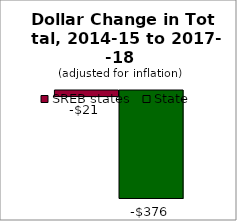
| Category | SREB states | State |
|---|---|---|
| 0 | -21.094 | -375.61 |